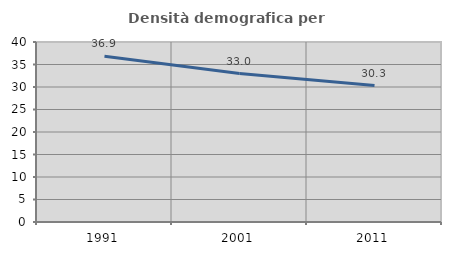
| Category | Densità demografica |
|---|---|
| 1991.0 | 36.852 |
| 2001.0 | 32.997 |
| 2011.0 | 30.309 |